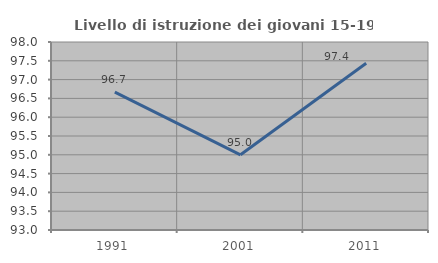
| Category | Livello di istruzione dei giovani 15-19 anni |
|---|---|
| 1991.0 | 96.667 |
| 2001.0 | 95 |
| 2011.0 | 97.436 |